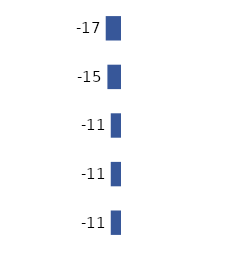
| Category | Series 0 |
|---|---|
| 0 | -17 |
| 1 | -15 |
| 2 | -11 |
| 3 | -11 |
| 4 | -11 |